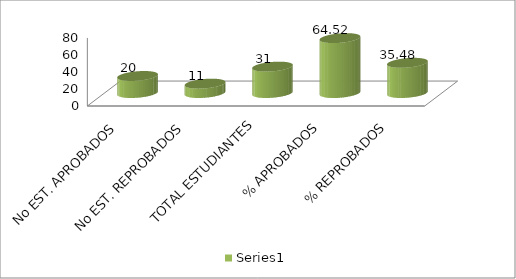
| Category | Series 0 |
|---|---|
| No EST. APROBADOS | 20 |
| No EST. REPROBADOS | 11 |
| TOTAL ESTUDIANTES | 31 |
| % APROBADOS | 64.516 |
| % REPROBADOS | 35.484 |